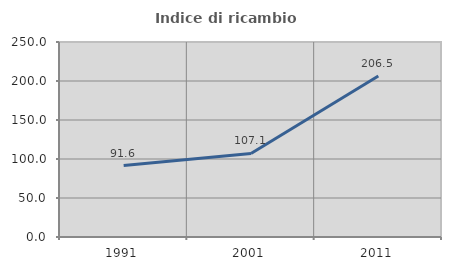
| Category | Indice di ricambio occupazionale  |
|---|---|
| 1991.0 | 91.558 |
| 2001.0 | 107.08 |
| 2011.0 | 206.522 |